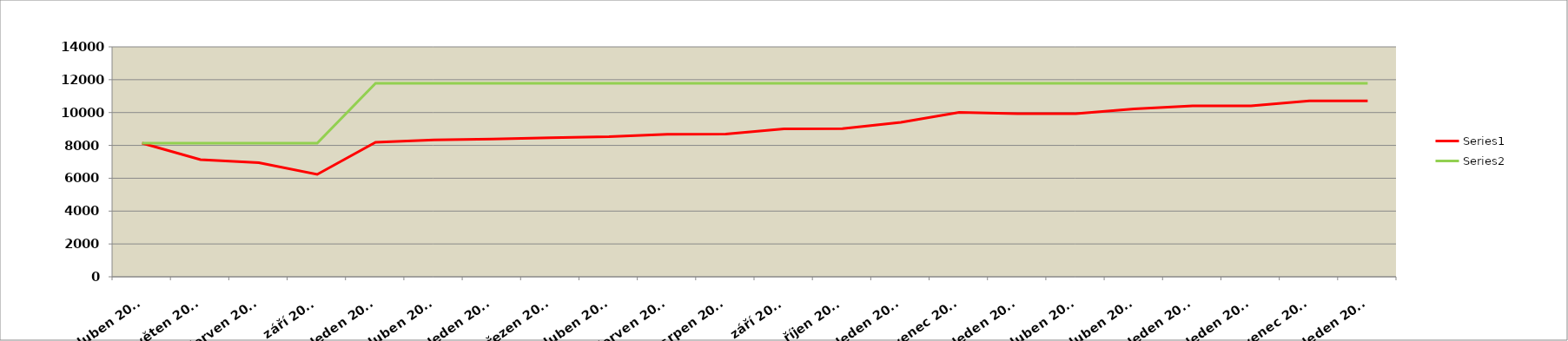
| Category | Series 0 | Series 1 |
|---|---|---|
| duben 2011 | 8136 | 8136 |
| květen 2011 | 7136 | 8136 |
| červen 2011 | 6951 | 8136 |
| září 2011 | 6237 | 8136 |
| leden 2012 | 8190 | 11778 |
| duben 2012 | 8329 | 11778 |
| leden 2013 | 8382 | 11778 |
| březen 2013 | 8472 | 11778 |
| duben 2013 | 8532 | 11778 |
| červen 2013 | 8676 | 11778 |
| srpen 2013 | 8692 | 11778 |
| září 2013 | 9011 | 11778 |
| říjen 2013 | 9020 | 11778 |
| leden 2014 | 9407 | 11778 |
| červenec 2014 | 10007 | 11778 |
| leden 2015 | 9937 | 11778 |
| duben 2015 | 9927 | 11778 |
| duben 2015 | 10227 | 11778 |
| leden 2016 | 10408 | 11778 |
| leden 2017 | 10408 | 11778 |
| červenec 2017 | 10708 | 11778 |
| leden 2018 | 10708 | 11778 |